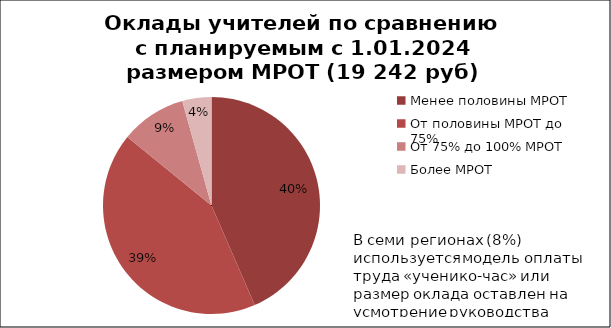
| Category | Series 0 |
|---|---|
| Менее половины МРОТ | 0.4 |
| От половины МРОТ до 75% | 0.39 |
| От 75% до 100% МРОТ | 0.09 |
| Более МРОТ | 0.04 |